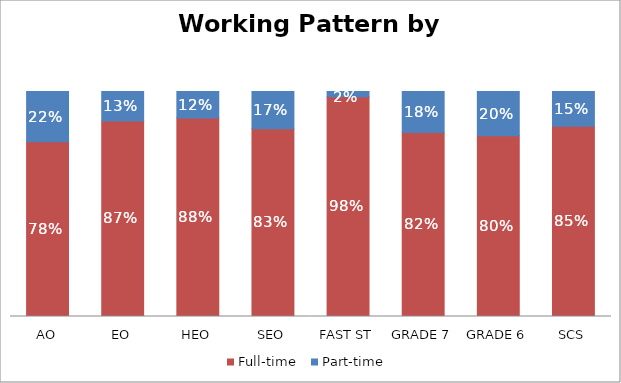
| Category | Full-time | Part-time |
|---|---|---|
| AO | 0.776 | 0.224 |
| EO | 0.869 | 0.131 |
| HEO | 0.883 | 0.117 |
| SEO | 0.835 | 0.165 |
| FAST ST | 0.976 | 0.024 |
| GRADE 7 | 0.817 | 0.183 |
| GRADE 6 | 0.803 | 0.197 |
| SCS | 0.846 | 0.154 |